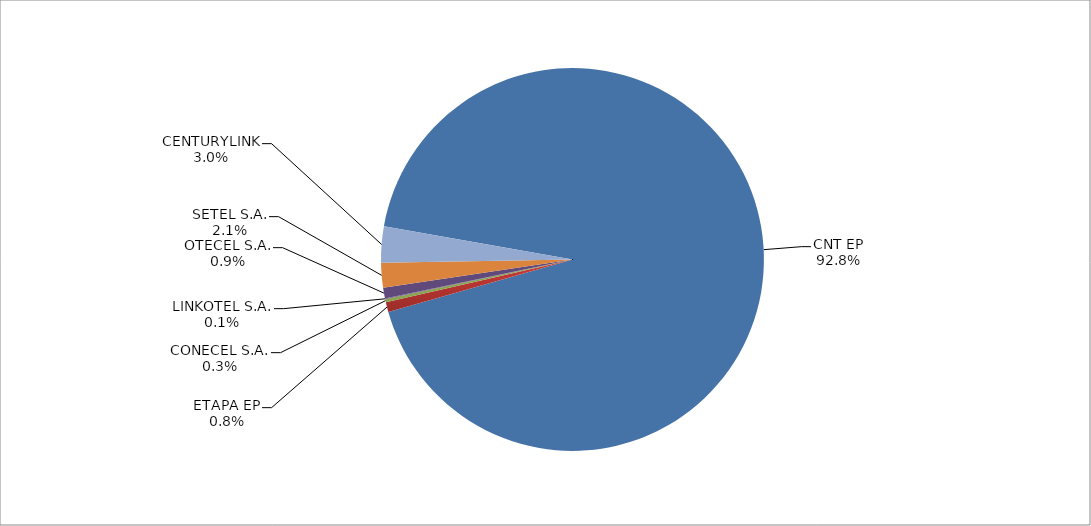
| Category | Series 0 |
|---|---|
| CNT EP | 2891 |
| ETAPA EP | 26 |
| CONECEL S.A. | 8 |
| LINKOTEL S.A. | 2 |
| OTECEL S.A. | 28 |
| SETEL S.A. | 65 |
| CENTURYLINK | 95 |